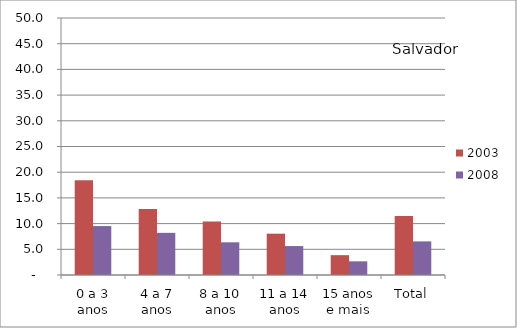
| Category | 2003 | 2008 |
|---|---|---|
| 0 a 3 anos | 18.45 | 9.52 |
| 4 a 7 anos | 12.84 | 8.2 |
| 8 a 10 anos | 10.39 | 6.36 |
| 11 a 14 anos | 8.04 | 5.63 |
| 15 anos e mais | 3.86 | 2.66 |
| Total | 11.48 | 6.54 |